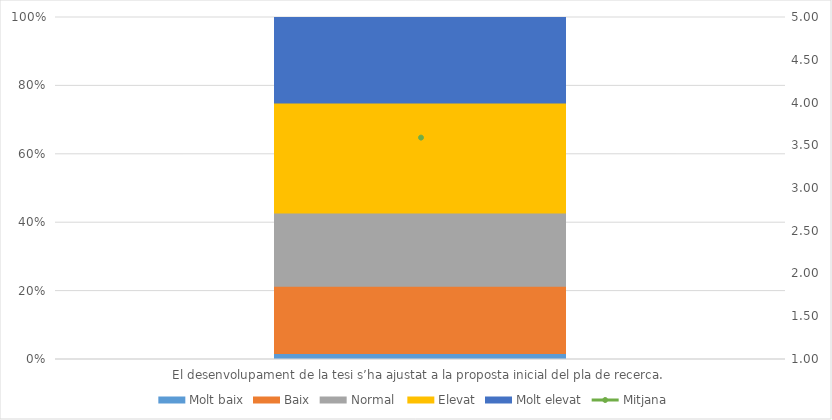
| Category | Molt baix | Baix | Normal  | Elevat | Molt elevat |
|---|---|---|---|---|---|
| El desenvolupament de la tesi s’ha ajustat a la proposta inicial del pla de recerca. | 1 | 11 | 12 | 18 | 14 |